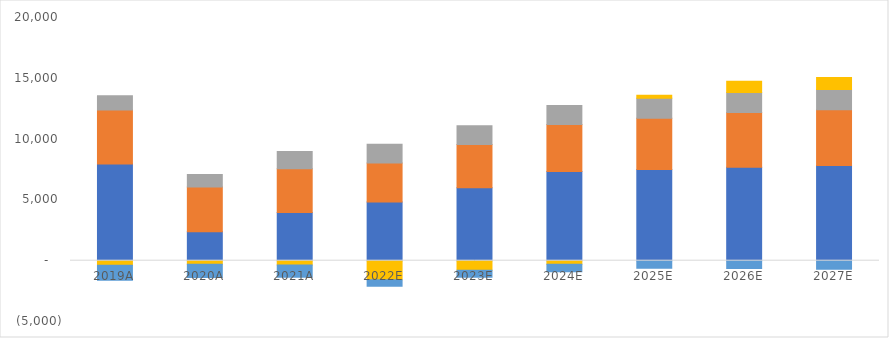
| Category | Aviation | Healthcare | Power | Renewables | Corporate |
|---|---|---|---|---|---|
| 2019A | 7962 | 4439 | 1171 | -366 | -1244 |
| 2020A | 2371 | 3688 | 1023 | -302 | -1071 |
| 2021A | 3956 | 3607 | 1418 | -363 | -1002 |
| 2022E | 4823.229 | 3221.569 | 1523.768 | -1568.065 | -523.484 |
| 2023E | 6000.224 | 3556.455 | 1536.366 | -780.862 | -572.259 |
| 2024E | 7328.762 | 3873.635 | 1560.823 | -298.403 | -618.476 |
| 2025E | 7506.631 | 4205.02 | 1651.954 | 249.246 | -629.525 |
| 2026E | 7679.469 | 4506.793 | 1646.435 | 919.609 | -638.807 |
| 2027E | 7837.469 | 4579.785 | 1654.256 | 988.205 | -694.176 |